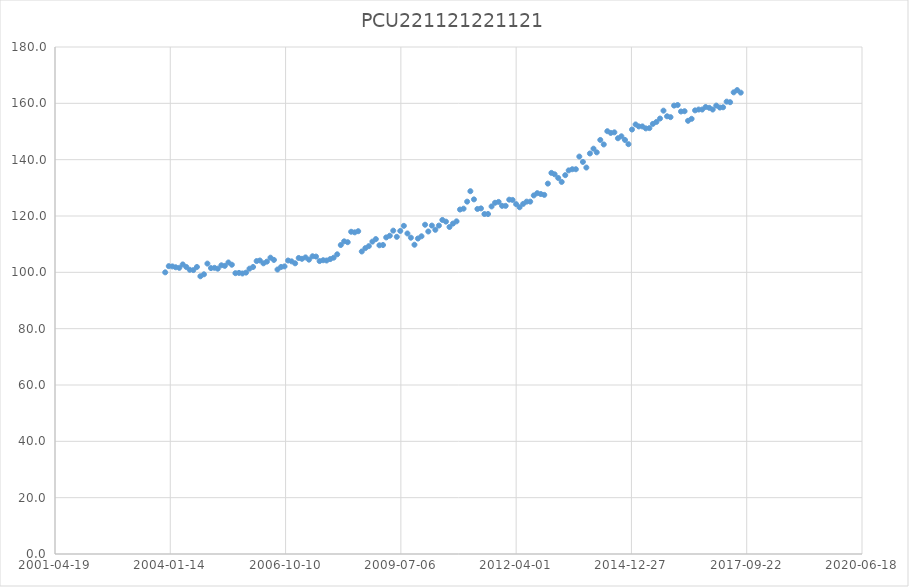
| Category | PCU221121221121 |
|---|---|
| 37956.0 | 100 |
| 37987.0 | 102.2 |
| 38018.0 | 102.1 |
| 38047.0 | 101.8 |
| 38078.0 | 101.6 |
| 38108.0 | 102.8 |
| 38139.0 | 101.9 |
| 38169.0 | 100.9 |
| 38200.0 | 100.8 |
| 38231.0 | 101.9 |
| 38261.0 | 98.6 |
| 38292.0 | 99.3 |
| 38322.0 | 103.1 |
| 38353.0 | 101.5 |
| 38384.0 | 101.6 |
| 38412.0 | 101.3 |
| 38443.0 | 102.5 |
| 38473.0 | 102.3 |
| 38504.0 | 103.5 |
| 38534.0 | 102.7 |
| 38565.0 | 99.7 |
| 38596.0 | 99.8 |
| 38626.0 | 99.6 |
| 38657.0 | 99.9 |
| 38687.0 | 101.3 |
| 38718.0 | 101.9 |
| 38749.0 | 104 |
| 38777.0 | 104.2 |
| 38808.0 | 103.2 |
| 38838.0 | 103.8 |
| 38869.0 | 105.2 |
| 38899.0 | 104.4 |
| 38930.0 | 101 |
| 38961.0 | 101.9 |
| 38991.0 | 102.1 |
| 39022.0 | 104.2 |
| 39052.0 | 103.9 |
| 39083.0 | 103.2 |
| 39114.0 | 105.1 |
| 39142.0 | 104.8 |
| 39173.0 | 105.3 |
| 39203.0 | 104.5 |
| 39234.0 | 105.7 |
| 39264.0 | 105.6 |
| 39295.0 | 104 |
| 39326.0 | 104.3 |
| 39356.0 | 104.2 |
| 39387.0 | 104.7 |
| 39417.0 | 105.2 |
| 39448.0 | 106.4 |
| 39479.0 | 109.7 |
| 39508.0 | 111 |
| 39539.0 | 110.7 |
| 39569.0 | 114.4 |
| 39600.0 | 114.2 |
| 39630.0 | 114.6 |
| 39661.0 | 107.4 |
| 39692.0 | 108.6 |
| 39722.0 | 109.3 |
| 39753.0 | 110.9 |
| 39783.0 | 111.8 |
| 39814.0 | 109.6 |
| 39845.0 | 109.7 |
| 39873.0 | 112.4 |
| 39904.0 | 113 |
| 39934.0 | 114.8 |
| 39965.0 | 112.6 |
| 39995.0 | 114.7 |
| 40026.0 | 116.5 |
| 40057.0 | 113.8 |
| 40087.0 | 112.3 |
| 40118.0 | 109.8 |
| 40148.0 | 112 |
| 40179.0 | 112.8 |
| 40210.0 | 116.9 |
| 40238.0 | 114.5 |
| 40269.0 | 116.6 |
| 40299.0 | 115.1 |
| 40330.0 | 116.6 |
| 40360.0 | 118.6 |
| 40391.0 | 118 |
| 40422.0 | 116.1 |
| 40452.0 | 117.3 |
| 40483.0 | 118.1 |
| 40513.0 | 122.3 |
| 40544.0 | 122.6 |
| 40575.0 | 125.1 |
| 40603.0 | 128.8 |
| 40634.0 | 125.9 |
| 40664.0 | 122.5 |
| 40695.0 | 122.7 |
| 40725.0 | 120.7 |
| 40756.0 | 120.7 |
| 40787.0 | 123.4 |
| 40817.0 | 124.7 |
| 40848.0 | 125 |
| 40878.0 | 123.6 |
| 40909.0 | 123.6 |
| 40940.0 | 125.8 |
| 40969.0 | 125.7 |
| 41000.0 | 124.2 |
| 41030.0 | 123.1 |
| 41061.0 | 124.3 |
| 41091.0 | 125.1 |
| 41122.0 | 125.1 |
| 41153.0 | 127.3 |
| 41183.0 | 128.1 |
| 41214.0 | 127.8 |
| 41244.0 | 127.5 |
| 41275.0 | 131.5 |
| 41306.0 | 135.3 |
| 41334.0 | 134.8 |
| 41365.0 | 133.5 |
| 41395.0 | 132.1 |
| 41426.0 | 134.5 |
| 41456.0 | 136.2 |
| 41487.0 | 136.6 |
| 41518.0 | 136.6 |
| 41548.0 | 141.1 |
| 41579.0 | 139.2 |
| 41609.0 | 137.2 |
| 41640.0 | 142.2 |
| 41671.0 | 143.9 |
| 41699.0 | 142.6 |
| 41730.0 | 147 |
| 41760.0 | 145.4 |
| 41791.0 | 150.1 |
| 41821.0 | 149.5 |
| 41852.0 | 149.7 |
| 41883.0 | 147.6 |
| 41913.0 | 148.3 |
| 41944.0 | 147 |
| 41974.0 | 145.5 |
| 42005.0 | 150.7 |
| 42036.0 | 152.5 |
| 42064.0 | 151.8 |
| 42095.0 | 151.8 |
| 42125.0 | 151.1 |
| 42156.0 | 151.2 |
| 42186.0 | 152.7 |
| 42217.0 | 153.4 |
| 42248.0 | 154.6 |
| 42278.0 | 157.4 |
| 42309.0 | 155.4 |
| 42339.0 | 155.1 |
| 42370.0 | 159.2 |
| 42401.0 | 159.4 |
| 42430.0 | 157.1 |
| 42461.0 | 157.2 |
| 42491.0 | 153.8 |
| 42522.0 | 154.5 |
| 42552.0 | 157.5 |
| 42583.0 | 157.8 |
| 42614.0 | 157.8 |
| 42644.0 | 158.7 |
| 42675.0 | 158.4 |
| 42705.0 | 157.8 |
| 42736.0 | 159.2 |
| 42767.0 | 158.5 |
| 42795.0 | 158.6 |
| 42826.0 | 160.6 |
| 42856.0 | 160.4 |
| 42887.0 | 163.9 |
| 42917.0 | 164.7 |
| 42948.0 | 163.8 |